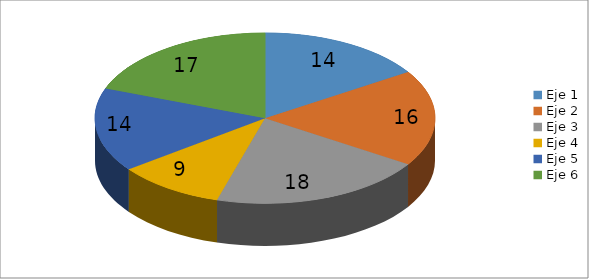
| Category | Series 0 |
|---|---|
| Eje 1 | 14 |
| Eje 2 | 16 |
| Eje 3 | 18 |
| Eje 4 | 9 |
| Eje 5 | 14 |
| Eje 6 | 17 |